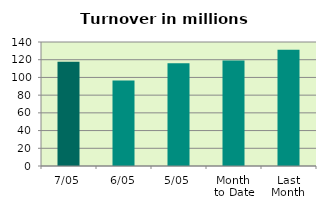
| Category | Series 0 |
|---|---|
| 7/05 | 117.791 |
| 6/05 | 96.601 |
| 5/05 | 116.125 |
| Month 
to Date | 119.043 |
| Last
Month | 131.238 |